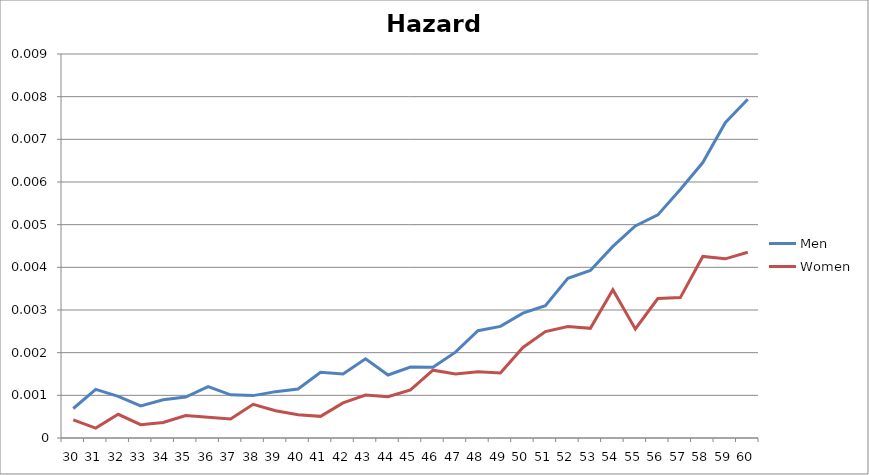
| Category | Men | Women |
|---|---|---|
| 30.0 | 0.001 | 0 |
| 31.0 | 0.001 | 0 |
| 32.0 | 0.001 | 0.001 |
| 33.0 | 0.001 | 0 |
| 34.0 | 0.001 | 0 |
| 35.0 | 0.001 | 0.001 |
| 36.0 | 0.001 | 0 |
| 37.0 | 0.001 | 0 |
| 38.0 | 0.001 | 0.001 |
| 39.0 | 0.001 | 0.001 |
| 40.0 | 0.001 | 0.001 |
| 41.0 | 0.002 | 0.001 |
| 42.0 | 0.002 | 0.001 |
| 43.0 | 0.002 | 0.001 |
| 44.0 | 0.001 | 0.001 |
| 45.0 | 0.002 | 0.001 |
| 46.0 | 0.002 | 0.002 |
| 47.0 | 0.002 | 0.001 |
| 48.0 | 0.003 | 0.002 |
| 49.0 | 0.003 | 0.002 |
| 50.0 | 0.003 | 0.002 |
| 51.0 | 0.003 | 0.002 |
| 52.0 | 0.004 | 0.003 |
| 53.0 | 0.004 | 0.003 |
| 54.0 | 0.004 | 0.003 |
| 55.0 | 0.005 | 0.003 |
| 56.0 | 0.005 | 0.003 |
| 57.0 | 0.006 | 0.003 |
| 58.0 | 0.006 | 0.004 |
| 59.0 | 0.007 | 0.004 |
| 60.0 | 0.008 | 0.004 |